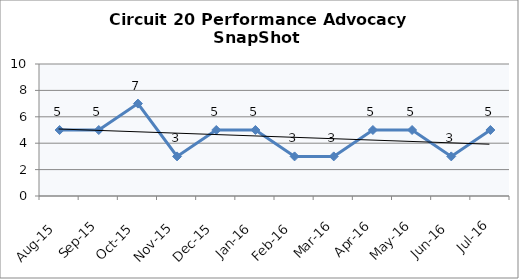
| Category | Circuit 20 |
|---|---|
| Aug-15 | 5 |
| Sep-15 | 5 |
| Oct-15 | 7 |
| Nov-15 | 3 |
| Dec-15 | 5 |
| Jan-16 | 5 |
| Feb-16 | 3 |
| Mar-16 | 3 |
| Apr-16 | 5 |
| May-16 | 5 |
| Jun-16 | 3 |
| Jul-16 | 5 |